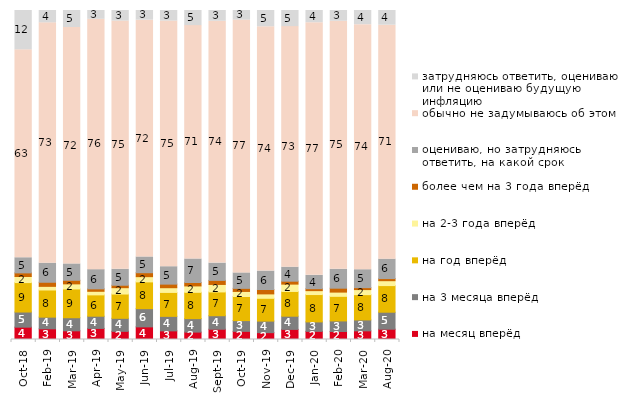
| Category | на месяц вперёд | на 3 месяца вперёд | на год вперёд | на 2-3 года вперёд | более чем на 3 года вперёд | оцениваю, но затрудняюсь ответить, на какой срок | обычно не задумываюсь об этом | затрудняюсь ответить, оцениваю или не оцениваю будущую инфляцию |
|---|---|---|---|---|---|---|---|---|
| 2018-10-01 | 3.75 | 4.6 | 8.95 | 1.85 | 1.1 | 4.6 | 63.2 | 11.95 |
| 2019-02-01 | 3.25 | 3.55 | 8.25 | 1.1 | 1.25 | 5.8 | 73.05 | 3.75 |
| 2019-03-01 | 2.636 | 3.978 | 8.752 | 1.542 | 1.094 | 4.973 | 71.855 | 5.172 |
| 2019-04-01 | 3.366 | 3.713 | 6.485 | 1.089 | 0.743 | 5.842 | 76.089 | 2.673 |
| 2019-05-01 | 2.476 | 3.962 | 7.38 | 1.932 | 0.743 | 4.854 | 75.433 | 3.219 |
| 2019-06-01 | 3.84 | 5.536 | 8.13 | 1.596 | 1.197 | 4.788 | 71.97 | 2.943 |
| 2019-07-01 | 2.624 | 4.406 | 7.277 | 1.436 | 1.089 | 5.297 | 74.653 | 3.218 |
| 2019-08-01 | 2.248 | 4.096 | 7.992 | 1.948 | 1.049 | 7.143 | 70.929 | 4.595 |
| 2019-09-01 | 3.119 | 4.109 | 7.228 | 2.277 | 1.238 | 5.248 | 73.515 | 3.267 |
| 2019-10-01 | 2.475 | 3.267 | 7.327 | 1.535 | 0.941 | 4.703 | 76.832 | 2.921 |
| 2019-11-01 | 2.079 | 3.515 | 6.931 | 1.337 | 1.337 | 5.594 | 74.257 | 4.95 |
| 2019-12-01 | 3.069 | 4.01 | 7.525 | 2.228 | 0.891 | 4.257 | 73.119 | 4.901 |
| 2020-01-01 | 2.475 | 2.871 | 8.317 | 1.188 | 0.594 | 4.059 | 76.782 | 3.713 |
| 2020-02-01 | 2.426 | 3.218 | 7.475 | 1.287 | 1.188 | 5.743 | 75.396 | 3.267 |
| 2020-03-01 | 2.628 | 3.322 | 7.685 | 1.537 | 0.595 | 5.454 | 74.467 | 4.313 |
| 2020-08-01 | 3.128 | 5.164 | 8.093 | 1.49 | 0.645 | 5.909 | 71.102 | 4.469 |